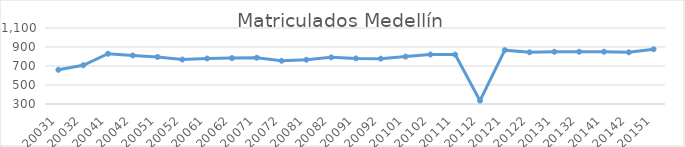
| Category | Matriculados Medellín |
|---|---|
| 20031 | 660 |
| 20032 | 708 |
| 20041 | 829 |
| 20042 | 811 |
| 20051 | 795 |
| 20052 | 768 |
| 20061 | 779 |
| 20062 | 783 |
| 20071 | 787 |
| 20072 | 755 |
| 20081 | 766 |
| 20082 | 791 |
| 20091 | 780 |
| 20092 | 777 |
| 20101 | 799 |
| 20102 | 821 |
| 20111 | 820 |
| 20112 | 334 |
| 20121 | 867 |
| 20122 | 844 |
| 20131 | 850 |
| 20132 | 850 |
| 20141 | 850 |
| 20142 | 844 |
| 20151 | 876 |